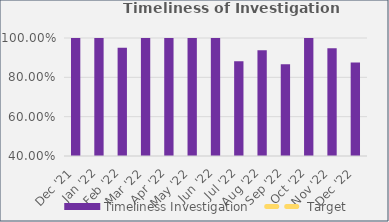
| Category | Timeliness Investigation |
|---|---|
| Dec '21 | 1 |
| Jan '22 | 1 |
| Feb '22 | 0.95 |
| Mar '22 | 1 |
| Apr '22 | 1 |
| May '22 | 1 |
| Jun '22 | 1 |
| Jul '22 | 0.882 |
| Aug '22 | 0.938 |
| Sep '22 | 0.867 |
| Oct '22 | 1 |
| Nov '22 | 0.947 |
| Dec '22 | 0.875 |